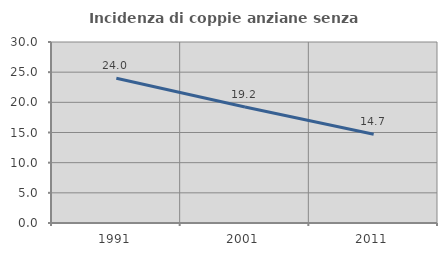
| Category | Incidenza di coppie anziane senza figli  |
|---|---|
| 1991.0 | 24 |
| 2001.0 | 19.231 |
| 2011.0 | 14.706 |